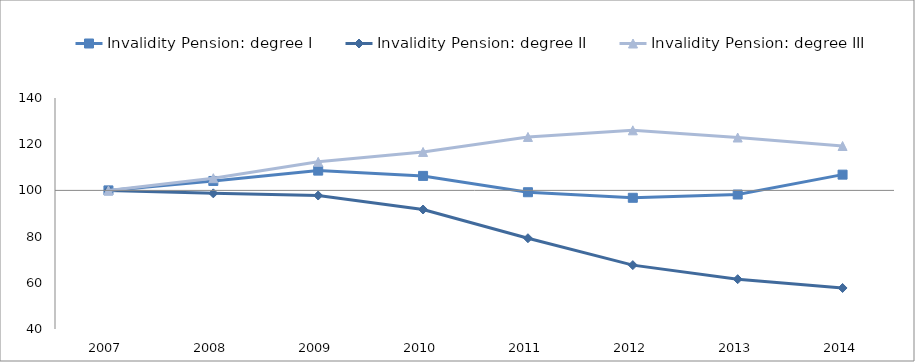
| Category | Invalidity Pension: degree I | Invalidity Pension: degree II | Invalidity Pension: degree III | #REF! | 0 |
|---|---|---|---|---|---|
| 2007.0 | 100 | 100 | 100 |  |  |
| 2008.0 | 104.077 | 98.727 | 105.281 |  |  |
| 2009.0 | 108.561 | 97.78 | 112.385 |  |  |
| 2010.0 | 106.276 | 91.727 | 116.638 |  |  |
| 2011.0 | 99.212 | 79.295 | 123.144 |  |  |
| 2012.0 | 96.804 | 67.653 | 126.011 |  |  |
| 2013.0 | 98.215 | 61.566 | 122.895 |  |  |
| 2014.0 | 106.818 | 57.754 | 119.22 |  |  |